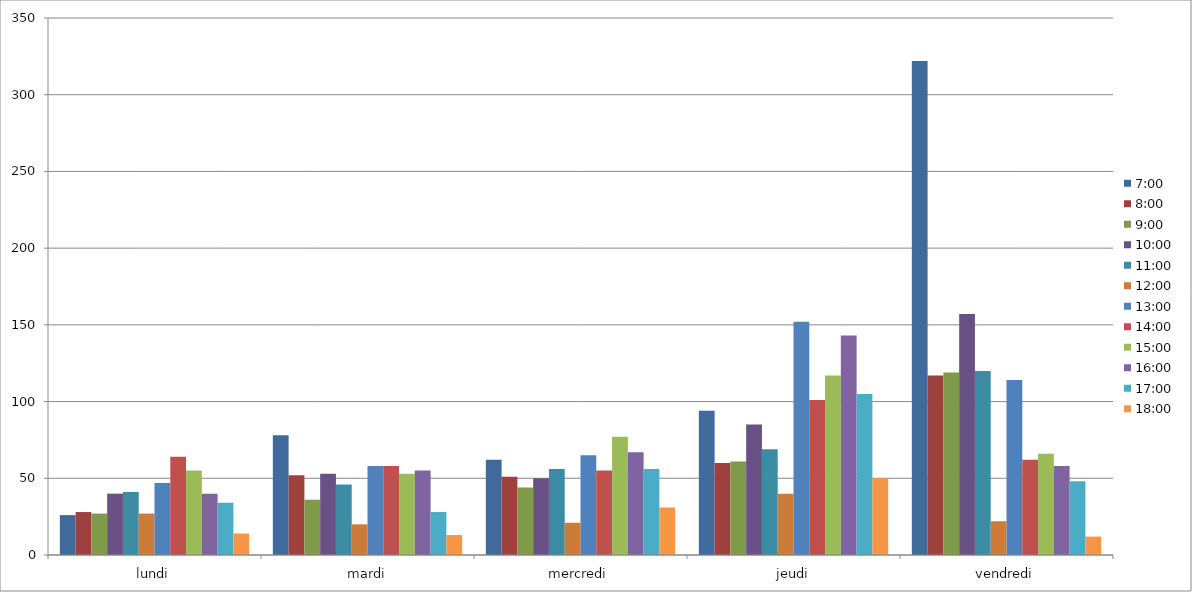
| Category | 07:00 | 08:00 | 09:00 | 10:00 | 11:00 | 12:00 | 13:00 | 14:00 | 15:00 | 16:00 | 17:00 | 18:00 |
|---|---|---|---|---|---|---|---|---|---|---|---|---|
| lundi | 26 | 28 | 27 | 40 | 41 | 27 | 47 | 64 | 55 | 40 | 34 | 14 |
| mardi | 78 | 52 | 36 | 53 | 46 | 20 | 58 | 58 | 53 | 55 | 28 | 13 |
| mercredi | 62 | 51 | 44 | 50 | 56 | 21 | 65 | 55 | 77 | 67 | 56 | 31 |
| jeudi | 94 | 60 | 61 | 85 | 69 | 40 | 152 | 101 | 117 | 143 | 105 | 50 |
| vendredi | 322 | 117 | 119 | 157 | 120 | 22 | 114 | 62 | 66 | 58 | 48 | 12 |